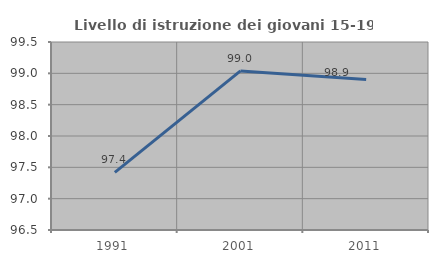
| Category | Livello di istruzione dei giovani 15-19 anni |
|---|---|
| 1991.0 | 97.419 |
| 2001.0 | 99.038 |
| 2011.0 | 98.901 |